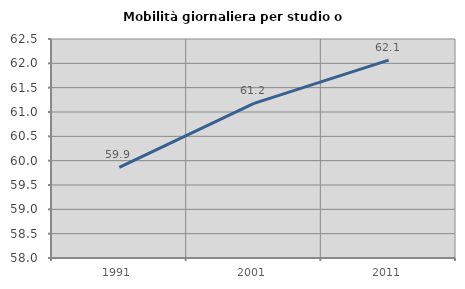
| Category | Mobilità giornaliera per studio o lavoro |
|---|---|
| 1991.0 | 59.862 |
| 2001.0 | 61.176 |
| 2011.0 | 62.066 |